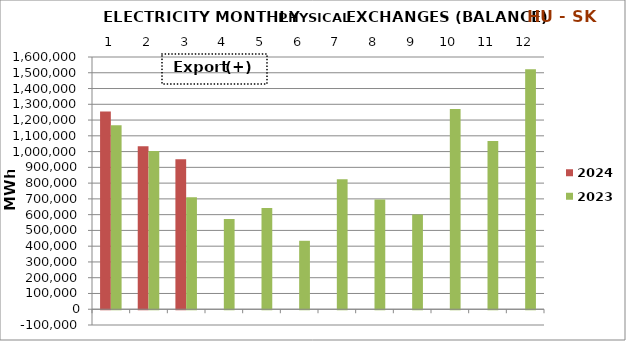
| Category | 2024 | 2023 |
|---|---|---|
| 0 | 1254127.676 | 1166585.06 |
| 1 | 1034499.705 | 1004039.276 |
| 2 | 951126.205 | 710374.65 |
| 3 | 0 | 572949.227 |
| 4 | 0 | 641721.635 |
| 5 | 0 | 434167.914 |
| 6 | 0 | 825008.214 |
| 7 | 0 | 695909.153 |
| 8 | 0 | 600140.25 |
| 9 | 0 | 1269476.064 |
| 10 | 0 | 1067741.083 |
| 11 | 0 | 1522866.782 |